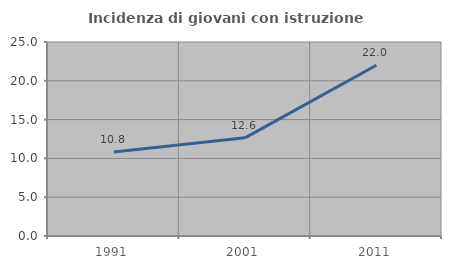
| Category | Incidenza di giovani con istruzione universitaria |
|---|---|
| 1991.0 | 10.823 |
| 2001.0 | 12.65 |
| 2011.0 | 22.005 |